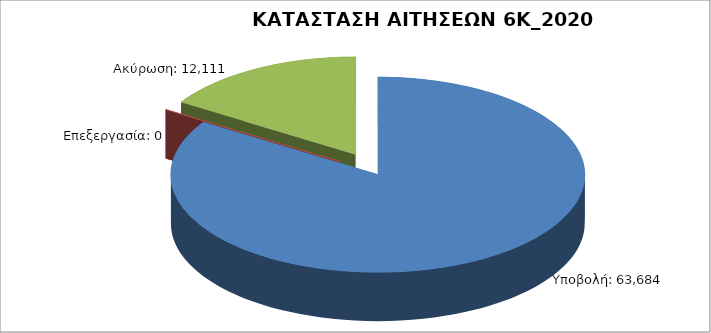
| Category | Series 0 |
|---|---|
| Υποβολή: | 63684 |
| Επεξεργασία: | 0 |
| Ακύρωση: | 12111 |